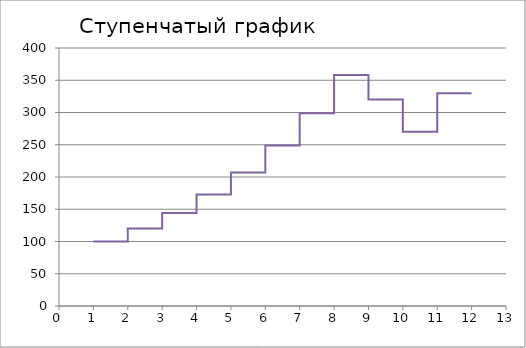
| Category | Y |
|---|---|
| 1.0 | 100 |
| 2.0 | 100 |
| 2.0 | 120 |
| 3.0 | 120 |
| 3.0 | 144 |
| 4.0 | 144 |
| 4.0 | 173 |
| 5.0 | 173 |
| 5.0 | 207 |
| 6.0 | 207 |
| 6.0 | 249 |
| 7.0 | 249 |
| 7.0 | 299 |
| 8.0 | 299 |
| 8.0 | 358 |
| 9.0 | 358 |
| 9.0 | 320 |
| 10.0 | 320 |
| 10.0 | 270 |
| 11.0 | 270 |
| 11.0 | 330 |
| 12.0 | 330 |